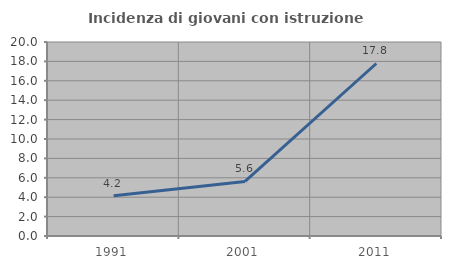
| Category | Incidenza di giovani con istruzione universitaria |
|---|---|
| 1991.0 | 4.156 |
| 2001.0 | 5.623 |
| 2011.0 | 17.784 |